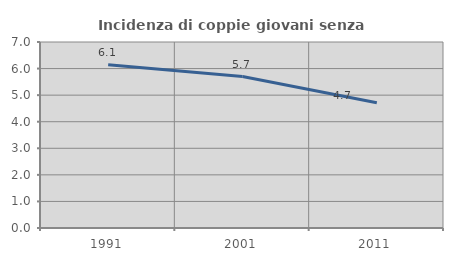
| Category | Incidenza di coppie giovani senza figli |
|---|---|
| 1991.0 | 6.143 |
| 2001.0 | 5.7 |
| 2011.0 | 4.714 |